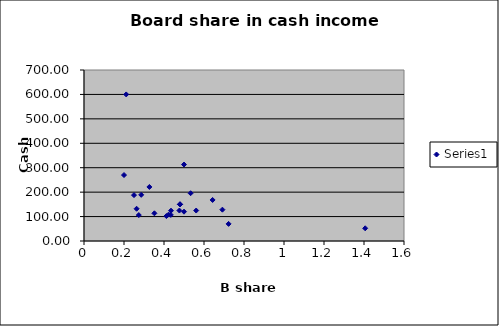
| Category | Series 0 |
|---|---|
| 1.406 | 52 |
| 0.643 | 168 |
| 0.25 | 187.8 |
| 0.723 | 70 |
| 0.561 | 124.68 |
| 0.477 | 124.68 |
| 0.692 | 128.28 |
| 0.434 | 106.8 |
| 0.5 | 120 |
| 0.412 | 102 |
| 0.48 | 150 |
| 0.5 | 313 |
| 0.48 | 150 |
| 0.533 | 195.63 |
| 0.435 | 124.2 |
| 0.2 | 270 |
| 0.286 | 189 |
| 0.48 | 150 |
| 0.263 | 132 |
| 0.211 | 600 |
| 0.352 | 113.4 |
| 0.274 | 106.2 |
| 0.423 | 108 |
| 0.327 | 221.24 |